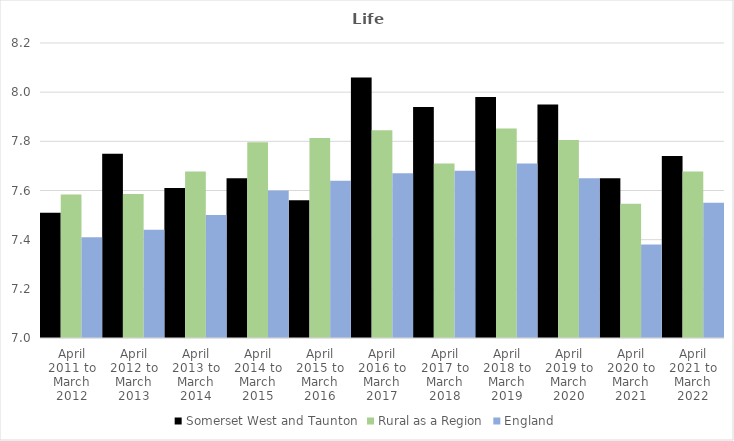
| Category | Somerset West and Taunton | Rural as a Region | England |
|---|---|---|---|
| April 2011 to March 2012 | 7.51 | 7.584 | 7.41 |
| April 2012 to March 2013 | 7.75 | 7.586 | 7.44 |
| April 2013 to March 2014 | 7.61 | 7.677 | 7.5 |
| April 2014 to March 2015 | 7.65 | 7.797 | 7.6 |
| April 2015 to March 2016 | 7.56 | 7.813 | 7.64 |
| April 2016 to March 2017 | 8.06 | 7.845 | 7.67 |
| April 2017 to March 2018 | 7.94 | 7.71 | 7.68 |
| April 2018 to March 2019 | 7.98 | 7.852 | 7.71 |
| April 2019 to March 2020 | 7.95 | 7.806 | 7.65 |
| April 2020 to March 2021 | 7.65 | 7.546 | 7.38 |
| April 2021 to March 2022 | 7.74 | 7.677 | 7.55 |